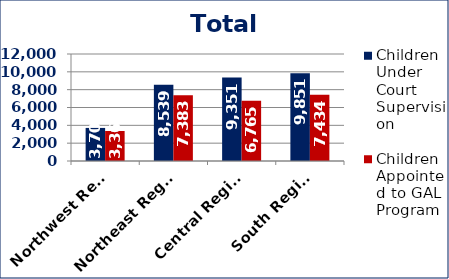
| Category | Children Under Court Supervision  | Children Appointed to GAL Program  |
|---|---|---|
| Northwest Region | 3709 | 3366 |
| Northeast Region | 8539 | 7383 |
| Central Region | 9351 | 6765 |
| South Region | 9851 | 7434 |